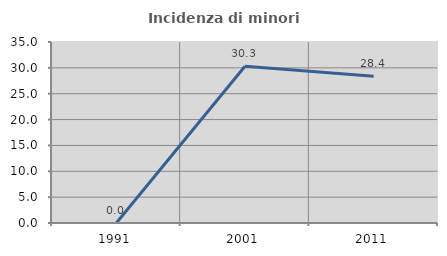
| Category | Incidenza di minori stranieri |
|---|---|
| 1991.0 | 0 |
| 2001.0 | 30.303 |
| 2011.0 | 28.355 |